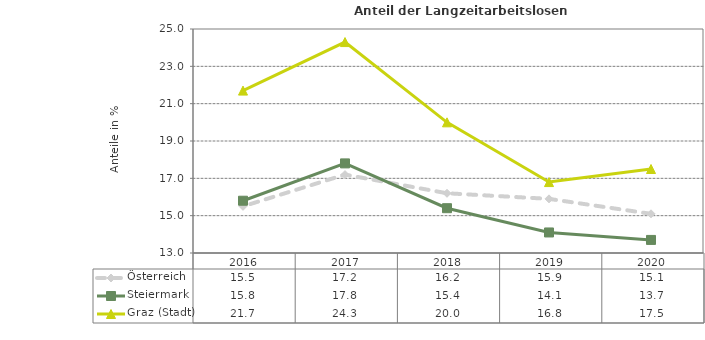
| Category | Österreich | Steiermark | Graz (Stadt) |
|---|---|---|---|
| 2020.0 | 15.1 | 13.7 | 17.5 |
| 2019.0 | 15.9 | 14.1 | 16.8 |
| 2018.0 | 16.2 | 15.4 | 20 |
| 2017.0 | 17.2 | 17.8 | 24.3 |
| 2016.0 | 15.5 | 15.8 | 21.7 |